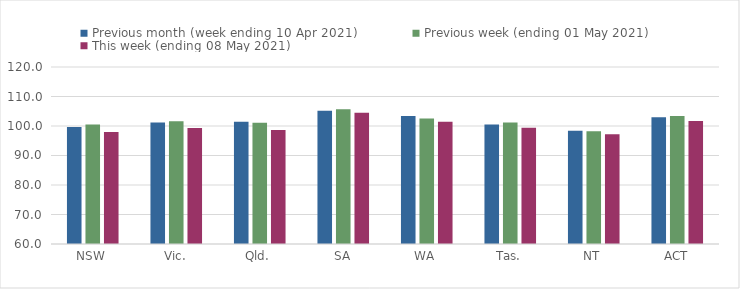
| Category | Previous month (week ending 10 Apr 2021) | Previous week (ending 01 May 2021) | This week (ending 08 May 2021) |
|---|---|---|---|
| NSW | 99.62 | 100.52 | 98 |
| Vic. | 101.21 | 101.64 | 99.34 |
| Qld. | 101.47 | 101.09 | 98.68 |
| SA | 105.18 | 105.64 | 104.53 |
| WA | 103.38 | 102.56 | 101.45 |
| Tas. | 100.49 | 101.21 | 99.39 |
| NT | 98.36 | 98.2 | 97.18 |
| ACT | 102.94 | 103.4 | 101.67 |